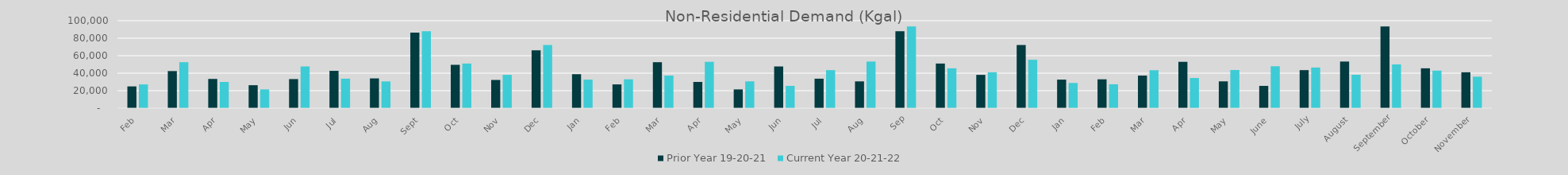
| Category | Prior Year 19-20-21 | Current Year 20-21-22 |
|---|---|---|
| Feb | 24891.705 | 27184.287 |
| Mar | 42416.796 | 52556.784 |
| Apr | 33427.881 | 30008.586 |
| May | 26254.448 | 21459.484 |
| Jun | 33248.873 | 47687.401 |
| Jul | 42679.938 | 33702.696 |
| Aug | 34036.498 | 30630.765 |
| Sep | 86367.775 | 87939.966 |
| Oct | 49561.754 | 51017.647 |
| Nov | 32261.42 | 38090.247 |
| Dec | 66164.871 | 72201.815 |
| Jan | 38851.995 | 32645.301 |
| Feb | 27184.287 | 32987.653 |
| Mar | 52556.784 | 37296.185 |
| Apr | 30008.586 | 52983.593 |
| May | 21459.484 | 30657.737 |
| Jun | 47687.401 | 25485.258 |
| Jul | 33702.696 | 43493.567 |
| Aug | 30630.765 | 53305.831 |
| Sep | 87939.966 | 93442.494 |
| Oct | 51017.647 | 45586.98 |
| Nov | 38090.247 | 41019.482 |
| Dec | 72201.815 | 55350.474 |
| Jan | 32645.301 | 28832.602 |
| Feb | 32987.653 | 27305.762 |
| Mar | 37296.185 | 43384.037 |
| Apr | 52983.593 | 34485.291 |
| May | 30657.737 | 43618.865 |
| June | 25485.258 | 47925.22 |
| July | 43493.567 | 46450.441 |
| August | 53305.831 | 38203.345 |
| September | 93442.494 | 50043.287 |
| October | 45586.98 | 42946.487 |
| November | 41019.482 | 36008.271 |